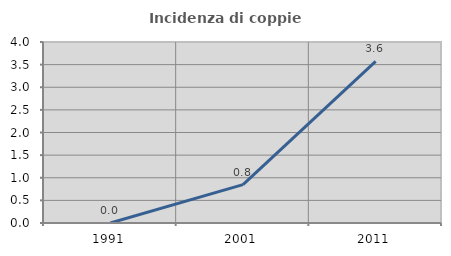
| Category | Incidenza di coppie miste |
|---|---|
| 1991.0 | 0 |
| 2001.0 | 0.847 |
| 2011.0 | 3.571 |